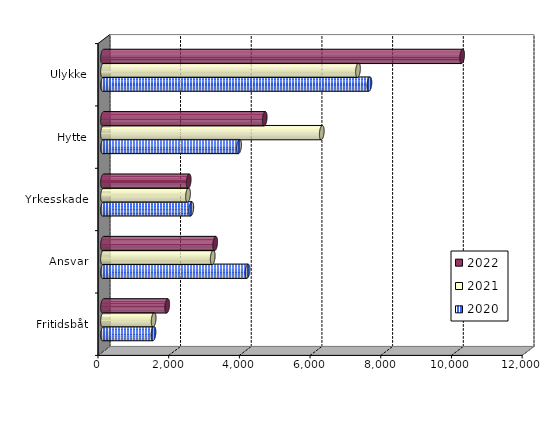
| Category | 2020 | 2021 | 2022 |
|---|---|---|---|
| Fritidsbåt | 1428.298 | 1433.31 | 1816.335 |
| Ansvar | 4087.944 | 3104.315 | 3173.582 |
| Yrkesskade | 2497.857 | 2405.707 | 2424.515 |
| Hytte | 3848.886 | 6189.859 | 4575 |
| Ulykke | 7537.45 | 7214.344 | 10160.967 |